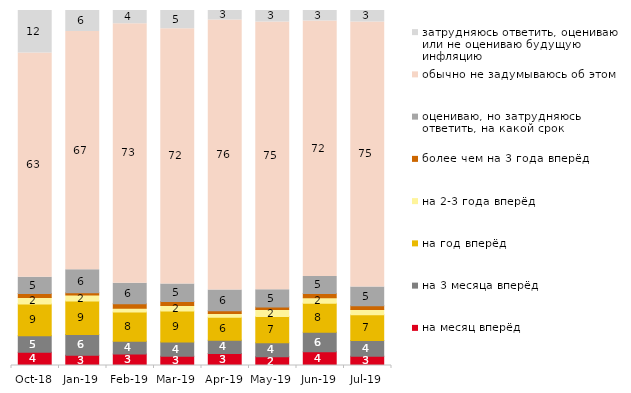
| Category | на месяц вперёд | на 3 месяца вперёд | на год вперёд | на 2-3 года вперёд | более чем на 3 года вперёд | оцениваю, но затрудняюсь ответить, на какой срок | обычно не задумываюсь об этом | затрудняюсь ответить, оцениваю или не оцениваю будущую инфляцию |
|---|---|---|---|---|---|---|---|---|
| 2018-10-01 | 3.75 | 4.6 | 8.95 | 1.85 | 1.1 | 4.6 | 63.2 | 11.95 |
| 2019-01-01 | 2.9 | 5.8 | 9.45 | 1.7 | 0.65 | 6.45 | 67.1 | 5.95 |
| 2019-02-01 | 3.25 | 3.55 | 8.25 | 1.1 | 1.25 | 5.8 | 73.05 | 3.75 |
| 2019-03-01 | 2.636 | 3.978 | 8.752 | 1.542 | 1.094 | 4.973 | 71.855 | 5.172 |
| 2019-04-01 | 3.366 | 3.713 | 6.485 | 1.089 | 0.743 | 5.842 | 76.089 | 2.673 |
| 2019-05-01 | 2.476 | 3.962 | 7.38 | 1.932 | 0.743 | 4.854 | 75.433 | 3.219 |
| 2019-06-01 | 3.84 | 5.536 | 8.13 | 1.596 | 1.197 | 4.788 | 71.97 | 2.943 |
| 2019-07-01 | 2.624 | 4.406 | 7.277 | 1.436 | 1.089 | 5.297 | 74.653 | 3.218 |